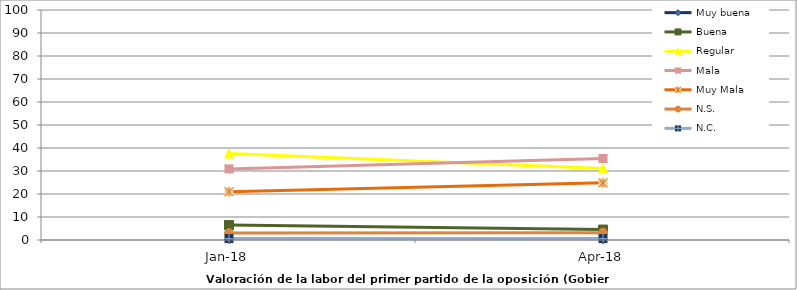
| Category | Muy buena | Buena | Regular | Mala | Muy Mala | N.S. | N.C. |
|---|---|---|---|---|---|---|---|
| 2018-01-01 | 0.4 | 6.5 | 37.6 | 30.9 | 21 | 3 | 0.6 |
| 2018-04-01 | 0.284 | 4.542 | 31.103 | 35.442 | 24.858 | 3.163 | 0.608 |